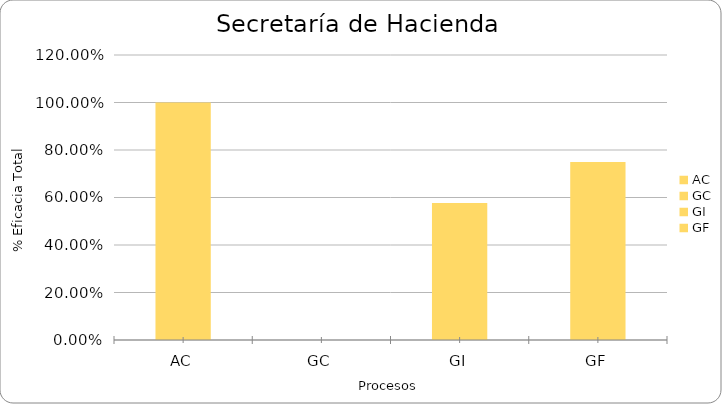
| Category | % Eficacia total |
|---|---|
| AC | 1 |
| GC | 0 |
| GI | 0.577 |
| GF | 0.75 |